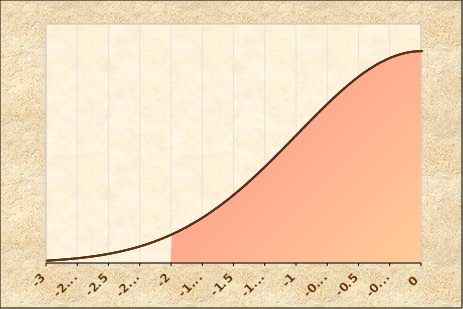
| Category | Series 0 |
|---|---|
| -3.0 | 0.004 |
| -2.9875 | 0.005 |
| -2.975 | 0.005 |
| -2.9625 | 0.005 |
| -2.95 | 0.005 |
| -2.9375 | 0.005 |
| -2.925 | 0.006 |
| -2.9125 | 0.006 |
| -2.9 | 0.006 |
| -2.8875 | 0.006 |
| -2.875 | 0.006 |
| -2.8625 | 0.007 |
| -2.85 | 0.007 |
| -2.8375 | 0.007 |
| -2.825 | 0.007 |
| -2.8125 | 0.008 |
| -2.8 | 0.008 |
| -2.7875 | 0.008 |
| -2.775 | 0.008 |
| -2.7625 | 0.009 |
| -2.75 | 0.009 |
| -2.7375 | 0.009 |
| -2.725 | 0.01 |
| -2.7125 | 0.01 |
| -2.7 | 0.01 |
| -2.6875 | 0.011 |
| -2.675 | 0.011 |
| -2.6625 | 0.012 |
| -2.65 | 0.012 |
| -2.6375 | 0.012 |
| -2.625 | 0.013 |
| -2.6125 | 0.013 |
| -2.6 | 0.014 |
| -2.5875 | 0.014 |
| -2.575 | 0.014 |
| -2.5625 | 0.015 |
| -2.55 | 0.015 |
| -2.5375 | 0.016 |
| -2.525 | 0.016 |
| -2.5125 | 0.017 |
| -2.5 | 0.018 |
| -2.4875 | 0.018 |
| -2.475 | 0.019 |
| -2.4625 | 0.019 |
| -2.45 | 0.02 |
| -2.4375 | 0.02 |
| -2.425 | 0.021 |
| -2.4125 | 0.022 |
| -2.4 | 0.022 |
| -2.3875 | 0.023 |
| -2.375 | 0.024 |
| -2.3625 | 0.024 |
| -2.35 | 0.025 |
| -2.3375 | 0.026 |
| -2.325 | 0.027 |
| -2.3125 | 0.028 |
| -2.3 | 0.028 |
| -2.2875 | 0.029 |
| -2.275 | 0.03 |
| -2.2625 | 0.031 |
| -2.25 | 0.032 |
| -2.2375 | 0.033 |
| -2.225 | 0.034 |
| -2.2125 | 0.035 |
| -2.2 | 0.035 |
| -2.1875 | 0.036 |
| -2.175 | 0.037 |
| -2.1625 | 0.038 |
| -2.15 | 0.04 |
| -2.1375 | 0.041 |
| -2.125 | 0.042 |
| -2.1125 | 0.043 |
| -2.1 | 0.044 |
| -2.0875 | 0.045 |
| -2.075 | 0.046 |
| -2.0625 | 0.048 |
| -2.05 | 0.049 |
| -2.0375 | 0.05 |
| -2.025 | 0.051 |
| -2.0125 | 0.053 |
| -2.0 | 0.054 |
| -1.9875 | 0.055 |
| -1.975 | 0.057 |
| -1.9625 | 0.058 |
| -1.95 | 0.06 |
| -1.9375 | 0.061 |
| -1.925 | 0.063 |
| -1.9125 | 0.064 |
| -1.9 | 0.066 |
| -1.8875 | 0.067 |
| -1.875 | 0.069 |
| -1.8625 | 0.07 |
| -1.85 | 0.072 |
| -1.8375 | 0.074 |
| -1.825 | 0.075 |
| -1.8125 | 0.077 |
| -1.8 | 0.079 |
| -1.7875 | 0.081 |
| -1.775 | 0.083 |
| -1.7625 | 0.084 |
| -1.75 | 0.086 |
| -1.7375 | 0.088 |
| -1.725 | 0.09 |
| -1.7125 | 0.092 |
| -1.7 | 0.094 |
| -1.6875 | 0.096 |
| -1.675 | 0.098 |
| -1.6625 | 0.1 |
| -1.65 | 0.102 |
| -1.6375 | 0.104 |
| -1.625 | 0.107 |
| -1.6125 | 0.109 |
| -1.6 | 0.111 |
| -1.5875 | 0.113 |
| -1.575 | 0.115 |
| -1.5625 | 0.118 |
| -1.55 | 0.12 |
| -1.5375 | 0.122 |
| -1.525 | 0.125 |
| -1.5125 | 0.127 |
| -1.5 | 0.13 |
| -1.4875 | 0.132 |
| -1.475 | 0.134 |
| -1.4625 | 0.137 |
| -1.45 | 0.139 |
| -1.4375 | 0.142 |
| -1.425 | 0.145 |
| -1.4125 | 0.147 |
| -1.4 | 0.15 |
| -1.3875 | 0.152 |
| -1.375 | 0.155 |
| -1.3625 | 0.158 |
| -1.35 | 0.16 |
| -1.3375 | 0.163 |
| -1.325 | 0.166 |
| -1.3125 | 0.169 |
| -1.3 | 0.171 |
| -1.2875 | 0.174 |
| -1.275 | 0.177 |
| -1.2625 | 0.18 |
| -1.25 | 0.183 |
| -1.2375 | 0.186 |
| -1.225 | 0.188 |
| -1.2125 | 0.191 |
| -1.2 | 0.194 |
| -1.1875 | 0.197 |
| -1.175 | 0.2 |
| -1.1625 | 0.203 |
| -1.15 | 0.206 |
| -1.1375 | 0.209 |
| -1.125 | 0.212 |
| -1.1125 | 0.215 |
| -1.1 | 0.218 |
| -1.0875 | 0.221 |
| -1.075 | 0.224 |
| -1.0625 | 0.227 |
| -1.05 | 0.23 |
| -1.0375 | 0.233 |
| -1.025 | 0.236 |
| -1.0125 | 0.239 |
| -1.0 | 0.242 |
| -0.9875 | 0.245 |
| -0.975 | 0.248 |
| -0.9625 | 0.251 |
| -0.95 | 0.254 |
| -0.9375 | 0.257 |
| -0.925 | 0.26 |
| -0.9125 | 0.263 |
| -0.9 | 0.266 |
| -0.8875 | 0.269 |
| -0.875 | 0.272 |
| -0.8625 | 0.275 |
| -0.85 | 0.278 |
| -0.8375 | 0.281 |
| -0.825 | 0.284 |
| -0.8125 | 0.287 |
| -0.8 | 0.29 |
| -0.7875 | 0.293 |
| -0.775 | 0.295 |
| -0.7625 | 0.298 |
| -0.75 | 0.301 |
| -0.7375 | 0.304 |
| -0.725 | 0.307 |
| -0.7125 | 0.31 |
| -0.7 | 0.312 |
| -0.6875 | 0.315 |
| -0.675 | 0.318 |
| -0.6625 | 0.32 |
| -0.65 | 0.323 |
| -0.6375 | 0.326 |
| -0.625 | 0.328 |
| -0.6125 | 0.331 |
| -0.6 | 0.333 |
| -0.5875 | 0.336 |
| -0.575 | 0.338 |
| -0.5625 | 0.341 |
| -0.55 | 0.343 |
| -0.5375 | 0.345 |
| -0.525 | 0.348 |
| -0.5125 | 0.35 |
| -0.5 | 0.352 |
| -0.4875 | 0.354 |
| -0.475 | 0.356 |
| -0.4625 | 0.358 |
| -0.45 | 0.361 |
| -0.4375 | 0.363 |
| -0.425 | 0.364 |
| -0.4125 | 0.366 |
| -0.4 | 0.368 |
| -0.3875 | 0.37 |
| -0.375 | 0.372 |
| -0.3625 | 0.374 |
| -0.35 | 0.375 |
| -0.3375 | 0.377 |
| -0.325 | 0.378 |
| -0.3125 | 0.38 |
| -0.3 | 0.381 |
| -0.2875 | 0.383 |
| -0.275 | 0.384 |
| -0.2625 | 0.385 |
| -0.25 | 0.387 |
| -0.2375 | 0.388 |
| -0.225 | 0.389 |
| -0.2125 | 0.39 |
| -0.2 | 0.391 |
| -0.1875 | 0.392 |
| -0.175 | 0.393 |
| -0.1625 | 0.394 |
| -0.15 | 0.394 |
| -0.1375 | 0.395 |
| -0.125 | 0.396 |
| -0.1125 | 0.396 |
| -0.1 | 0.397 |
| -0.0875 | 0.397 |
| -0.075 | 0.398 |
| -0.0625 | 0.398 |
| -0.05 | 0.398 |
| -0.0375 | 0.399 |
| -0.025 | 0.399 |
| -0.0125 | 0.399 |
| 0.0 | 0.399 |